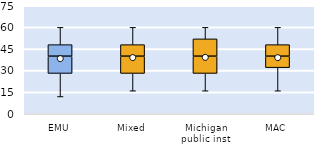
| Category | 25th | 50th | 75th |
|---|---|---|---|
| EMU | 28 | 12 | 8 |
| Mixed | 28 | 12 | 8 |
| Michigan public inst | 28 | 12 | 12 |
| MAC | 32 | 8 | 8 |